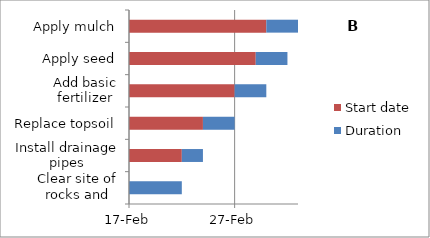
| Category | Start date | Duration |
|---|---|---|
| Clear site of rocks and stumps | 2012-02-17 | 5 |
| Install drainage pipes | 2012-02-22 | 2 |
| Replace topsoil | 2012-02-24 | 3 |
| Add basic fertilizer | 2012-02-27 | 3 |
| Apply seed | 2012-02-29 | 3 |
| Apply mulch | 2012-03-01 | 3 |